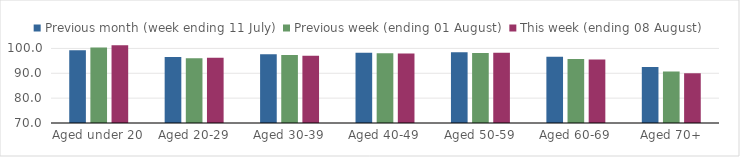
| Category | Previous month (week ending 11 July) | Previous week (ending 01 August) | This week (ending 08 August) |
|---|---|---|---|
| Aged under 20 | 99.274 | 100.421 | 101.237 |
| Aged 20-29 | 96.541 | 96.076 | 96.206 |
| Aged 30-39 | 97.672 | 97.349 | 97.102 |
| Aged 40-49 | 98.292 | 98.033 | 97.931 |
| Aged 50-59 | 98.473 | 98.2 | 98.273 |
| Aged 60-69 | 96.663 | 95.745 | 95.54 |
| Aged 70+ | 92.504 | 90.741 | 90.012 |